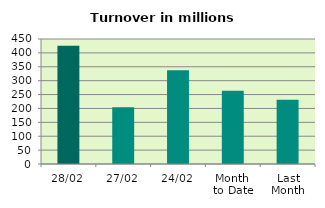
| Category | Series 0 |
|---|---|
| 28/02 | 425.288 |
| 27/02 | 204.115 |
| 24/02 | 337.271 |
| Month 
to Date | 263.32 |
| Last
Month | 231.348 |